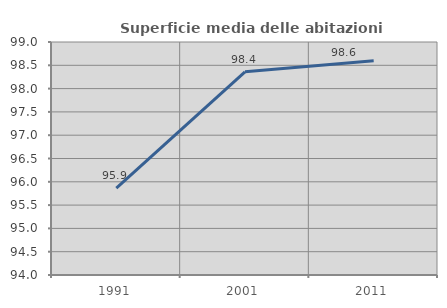
| Category | Superficie media delle abitazioni occupate |
|---|---|
| 1991.0 | 95.864 |
| 2001.0 | 98.361 |
| 2011.0 | 98.6 |